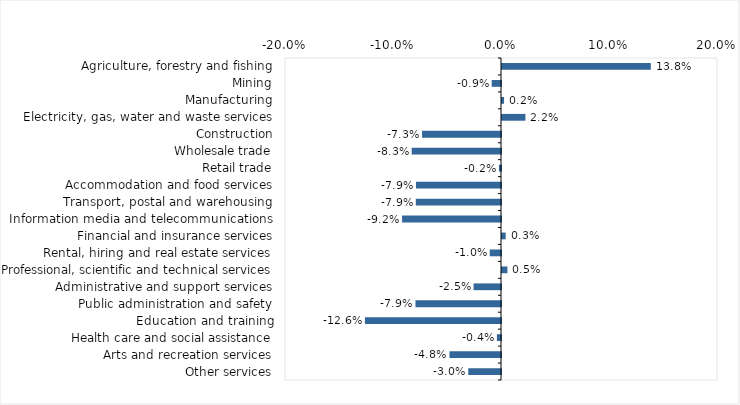
| Category | This week |
|---|---|
| Agriculture, forestry and fishing | 0.138 |
| Mining | -0.009 |
| Manufacturing | 0.002 |
| Electricity, gas, water and waste services | 0.022 |
| Construction | -0.073 |
| Wholesale trade | -0.083 |
| Retail trade | -0.002 |
| Accommodation and food services | -0.079 |
| Transport, postal and warehousing | -0.079 |
| Information media and telecommunications | -0.092 |
| Financial and insurance services | 0.003 |
| Rental, hiring and real estate services | -0.01 |
| Professional, scientific and technical services | 0.005 |
| Administrative and support services | -0.025 |
| Public administration and safety | -0.079 |
| Education and training | -0.126 |
| Health care and social assistance | -0.004 |
| Arts and recreation services | -0.048 |
| Other services | -0.03 |